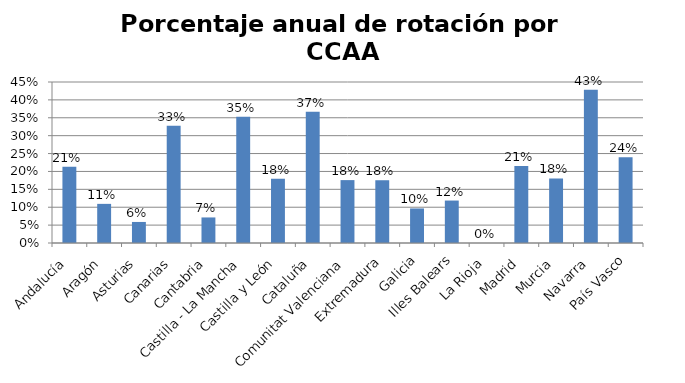
| Category | Porcentaje |
|---|---|
| Andalucía | 0.213 |
| Aragón | 0.109 |
| Asturias | 0.059 |
| Canarias | 0.328 |
| Cantabria | 0.071 |
| Castilla - La Mancha | 0.353 |
| Castilla y León | 0.18 |
| Cataluña | 0.367 |
| Comunitat Valenciana | 0.176 |
| Extremadura | 0.175 |
| Galicia | 0.097 |
| Illes Balears | 0.119 |
| La Rioja | 0 |
| Madrid | 0.215 |
| Murcia | 0.18 |
| Navarra | 0.429 |
| País Vasco | 0.24 |